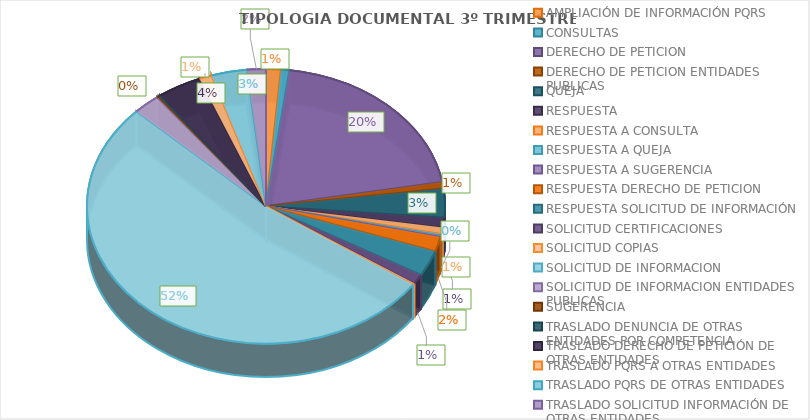
| Category | TIPOLOGIA DOCUMENTAL 3º TRIMESTRE 2020 |
|---|---|
| AMPLIACIÓN DE INFORMACIÓN PQRS | 7 |
| CONSULTAS | 4 |
| DERECHO DE PETICION | 106 |
| DERECHO DE PETICION ENTIDADES PUBLICAS | 4 |
| QUEJA | 18 |
| RESPUESTA | 6 |
| RESPUESTA A CONSULTA | 4 |
| RESPUESTA A QUEJA | 1 |
| RESPUESTA A SUGERENCIA | 1 |
| RESPUESTA DERECHO DE PETICION | 9 |
| RESPUESTA SOLICITUD DE INFORMACIÓN | 16 |
| SOLICITUD CERTIFICACIONES | 6 |
| SOLICITUD COPIAS | 1 |
| SOLICITUD DE INFORMACION | 277 |
| SOLICITUD DE INFORMACION ENTIDADES PUBLICAS | 13 |
| SUGERENCIA | 1 |
| TRASLADO DENUNCIA DE OTRAS ENTIDADES POR COMPETENCIA | 1 |
| TRASLADO DERECHO DE PETICIÓN DE OTRAS ENTIDADES | 21 |
| TRASLADO PQRS A OTRAS ENTIDADES | 6 |
| TRASLADO PQRS DE OTRAS ENTIDADES | 17 |
| TRASLADO SOLICITUD INFORMACIÓN DE OTRAS ENTIDADES | 9 |